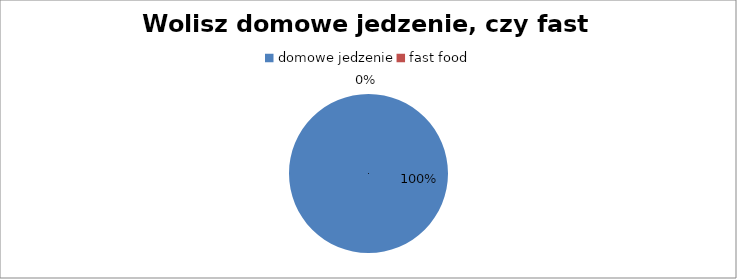
| Category | Wolisz domowe jedzenie, czy fast food? |
|---|---|
| domowe jedzenie | 28 |
| fast food | 0 |